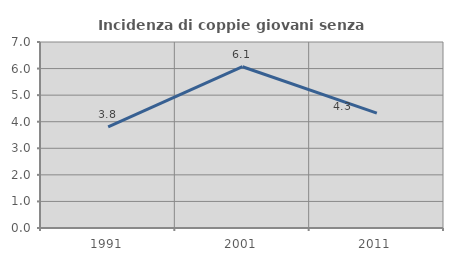
| Category | Incidenza di coppie giovani senza figli |
|---|---|
| 1991.0 | 3.803 |
| 2001.0 | 6.069 |
| 2011.0 | 4.322 |